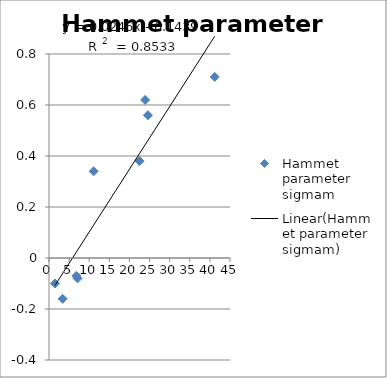
| Category | Hammet parameter sigmam |
|---|---|
| 3.4 | -0.16 |
| 1.5 | -0.1 |
| 7.1 | -0.08 |
| 6.8 | -0.07 |
| 11.1 | 0.34 |
| 22.5 | 0.38 |
| 24.6 | 0.56 |
| 23.9 | 0.62 |
| 41.2 | 0.71 |